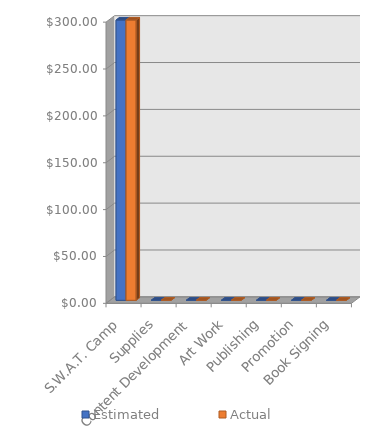
| Category | Estimated | Actual |
|---|---|---|
| S.W.A.T. Camp | 299 | 299 |
| Supplies | 0 | 0 |
| Content Development | 0 | 0 |
| Art Work | 0 | 0 |
| Publishing | 0 | 0 |
| Promotion | 0 | 0 |
| Book Signing | 0 | 0 |